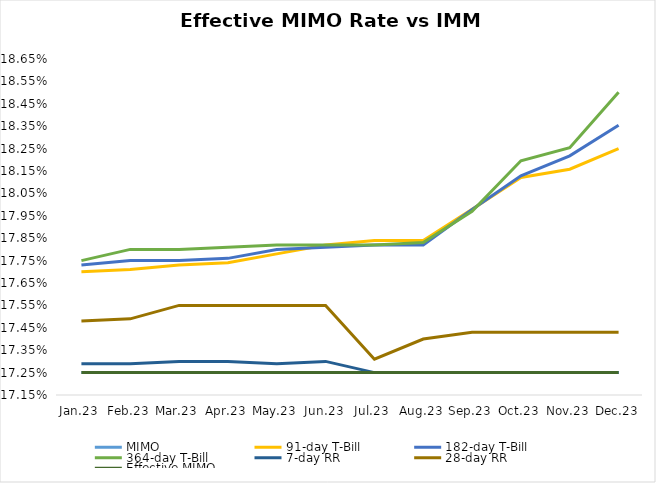
| Category | MIMO | 91-day T-Bill | 182-day T-Bill | 364-day T-Bill | 7-day RR | 28-day RR | Effective MIMO |
|---|---|---|---|---|---|---|---|
| Jan.23 | 0.172 | 0.177 | 0.177 | 0.178 | 0.173 | 0.175 | 0.172 |
| Feb.23 | 0.172 | 0.177 | 0.178 | 0.178 | 0.173 | 0.175 | 0.172 |
| Mar.23 | 0.172 | 0.177 | 0.178 | 0.178 | 0.173 | 0.176 | 0.172 |
| Apr.23 | 0.172 | 0.177 | 0.178 | 0.178 | 0.173 | 0.176 | 0.172 |
| May.23 | 0.172 | 0.178 | 0.178 | 0.178 | 0.173 | 0.176 | 0.172 |
| Jun.23 | 0.172 | 0.178 | 0.178 | 0.178 | 0.173 | 0.176 | 0.172 |
| Jul.23 | 0.172 | 0.178 | 0.178 | 0.178 | 0.172 | 0.173 | 0.172 |
| Aug.23 | 0.172 | 0.178 | 0.178 | 0.178 | 0.172 | 0.174 | 0.172 |
| Sep.23 | 0.172 | 0.18 | 0.18 | 0.18 | 0.172 | 0.174 | 0.172 |
| Oct.23 | 0.172 | 0.181 | 0.181 | 0.182 | 0.172 | 0.174 | 0.172 |
| Nov.23 | 0.172 | 0.182 | 0.182 | 0.183 | 0.172 | 0.174 | 0.172 |
| Dec.23 | 0.172 | 0.182 | 0.184 | 0.185 | 0.172 | 0.174 | 0.172 |